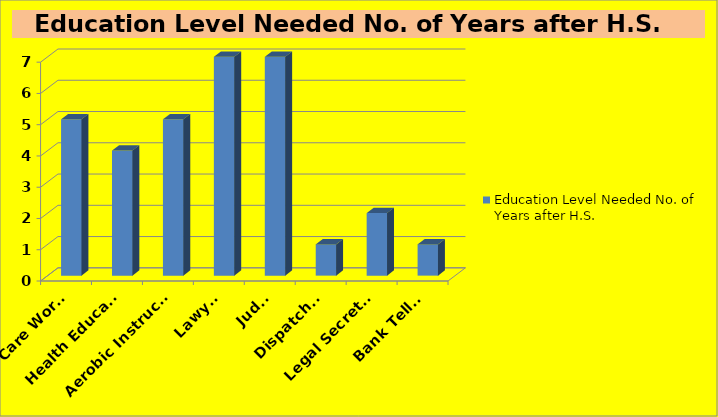
| Category | Education Level Needed No. of Years after H.S. |
|---|---|
| Child Care Worker | 5 |
| Health Educator | 4 |
| Aerobic Instructor | 5 |
| Lawyer | 7 |
| Judge | 7 |
| Dispatcher | 1 |
| Legal Secretary | 2 |
| Bank Teller | 1 |